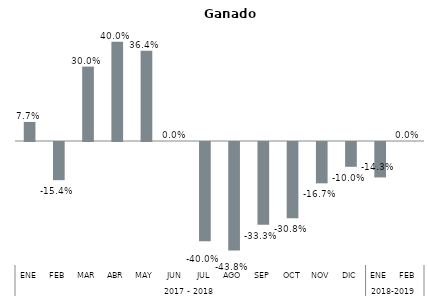
| Category | Jalisco |
|---|---|
| 0 | 0.077 |
| 1 | -0.154 |
| 2 | 0.3 |
| 3 | 0.4 |
| 4 | 0.364 |
| 5 | 0 |
| 6 | -0.4 |
| 7 | -0.438 |
| 8 | -0.333 |
| 9 | -0.308 |
| 10 | -0.167 |
| 11 | -0.1 |
| 12 | -0.143 |
| 13 | 0 |